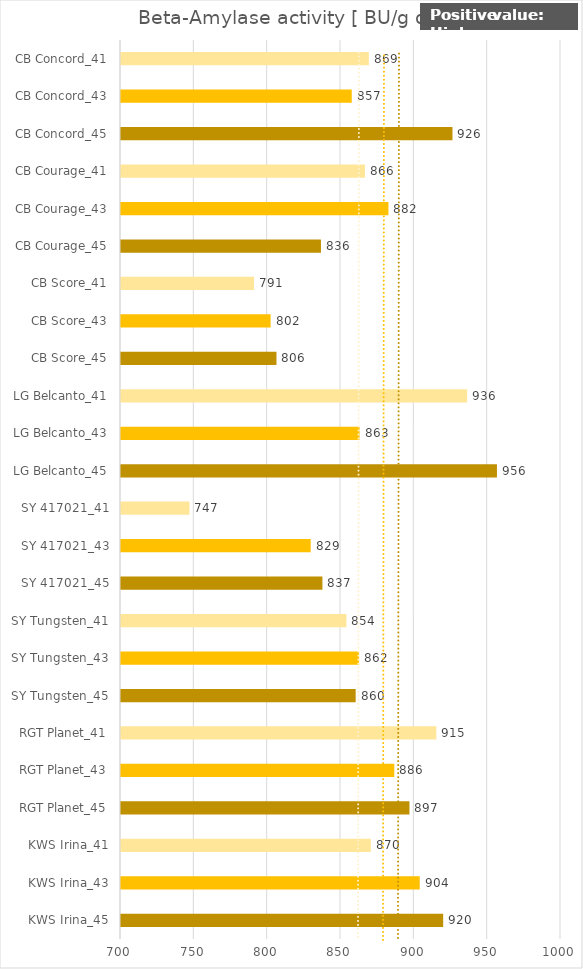
| Category |   Beta-Amylase activity [ BU/g dm] |
|---|---|
| KWS Irina_45 | 919.667 |
| KWS Irina_43 | 903.667 |
| KWS Irina_41 | 870.333 |
| RGT Planet_45 | 896.667 |
| RGT Planet_43 | 886.333 |
| RGT Planet_41 | 915 |
| SY Tungsten_45 | 860 |
| SY Tungsten_43 | 862.333 |
| SY Tungsten_41 | 853.667 |
| SY 417021_45 | 837.333 |
| SY 417021_43 | 829.333 |
| SY 417021_41 | 746.667 |
| LG Belcanto_45 | 956.333 |
| LG Belcanto_43 | 862.667 |
| LG Belcanto_41 | 936 |
| CB Score_45 | 806 |
| CB Score_43 | 802 |
| CB Score_41 | 790.667 |
| CB Courage_45 | 836.333 |
| CB Courage_43 | 882.333 |
| CB Courage_41 | 866.333 |
| CB Concord_45 | 926 |
| CB Concord_43 | 857.333 |
| CB Concord_41 | 869 |